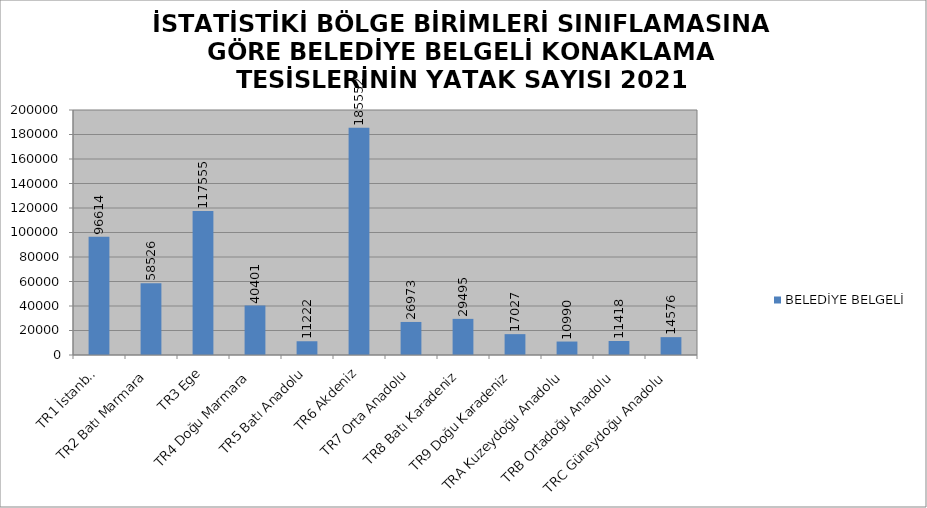
| Category | BELEDİYE BELGELİ |
|---|---|
| TR1 İstanbul | 96614 |
| TR2 Batı Marmara | 58526 |
| TR3 Ege | 117555 |
| TR4 Doğu Marmara | 40401 |
| TR5 Batı Anadolu | 11222 |
| TR6 Akdeniz | 185552 |
| TR7 Orta Anadolu | 26973 |
| TR8 Batı Karadeniz | 29495 |
| TR9 Doğu Karadeniz | 17027 |
| TRA Kuzeydoğu Anadolu | 10990 |
| TRB Ortadoğu Anadolu | 11418 |
| TRC Güneydoğu Anadolu | 14576 |